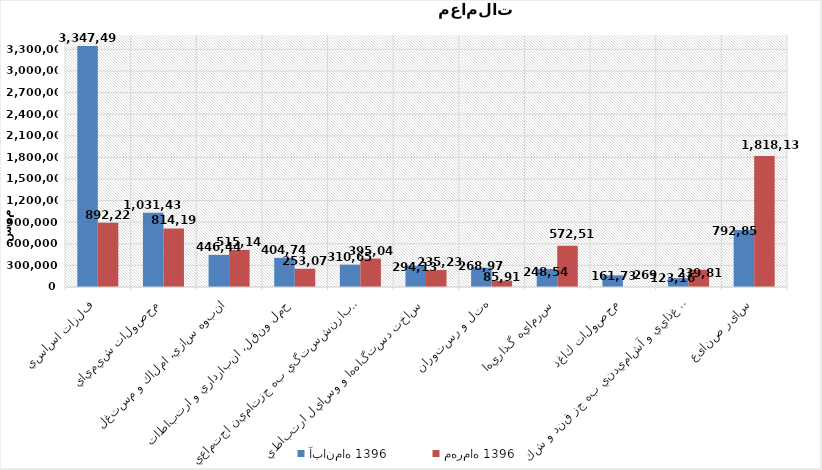
| Category | آبان‌ماه 1396 | مهرماه 1396 |
|---|---|---|
| فلزات اساسي | 3347493.853 | 892221.462 |
| محصولات شيميايي | 1031432.563 | 814194.064 |
| انبوه سازي، املاك و مستغلات | 446446.574 | 515139.97 |
| حمل ونقل، انبارداري و ارتباطات | 404742.827 | 253072.066 |
| بيمه وصندوق بازنشستگي به جزتامين اجتماعي | 310656.478 | 395046.96 |
| ساخت دستگاه‌ها و وسايل ارتباطي | 294130.327 | 235233.689 |
| هتل و رستوران | 268974.9 | 85919.085 |
| سرمايه گذاريها | 248542.535 | 572514.991 |
| محصولات كاغذي | 161731.979 | 269.187 |
| محصولات غذايي و آشاميدني به جز قند و شكر | 123160.678 | 239811.625 |
| سایر صنایع | 792857.535 | 1818135.606 |